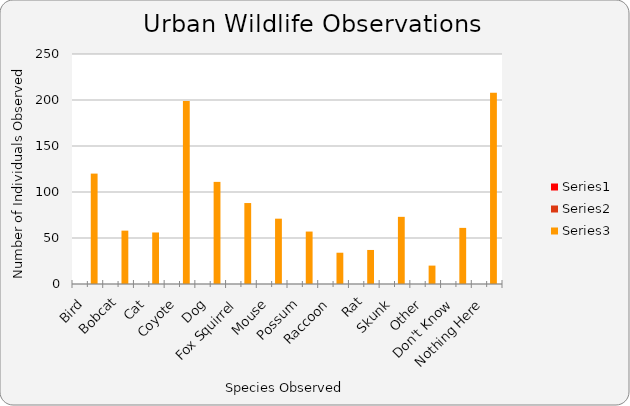
| Category | Series 0 | Series 1 | Series 2 |
|---|---|---|---|
| Bird |  |  | 120 |
| Bobcat |  |  | 58 |
| Cat |  |  | 56 |
| Coyote |  |  | 199 |
| Dog |  |  | 111 |
| Fox Squirrel |  |  | 88 |
| Mouse |  |  | 71 |
| Possum |  |  | 57 |
| Raccoon |  |  | 34 |
| Rat |  |  | 37 |
| Skunk |  |  | 73 |
| Other |  |  | 20 |
| Don't Know |  |  | 61 |
| Nothing Here |  |  | 208 |